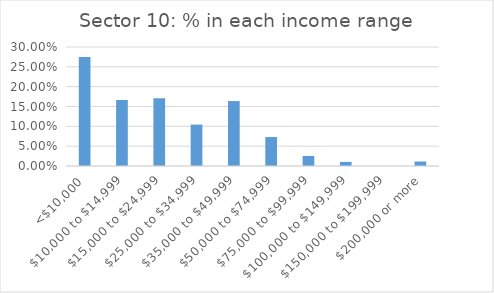
| Category | Series 0 |
|---|---|
| <$10,000 | 0.275 |
| $10,000 to $14,999 | 0.166 |
| $15,000 to $24,999 | 0.171 |
| $25,000 to $34,999 | 0.104 |
| $35,000 to $49,999 | 0.164 |
| $50,000 to $74,999 | 0.073 |
| $75,000 to $99,999 | 0.025 |
| $100,000 to $149,999 | 0.01 |
| $150,000 to $199,999 | 0 |
| $200,000 or more | 0.011 |